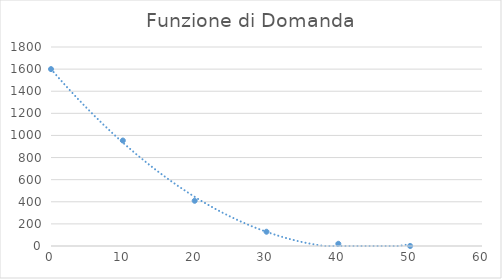
| Category | Series 0 |
|---|---|
| 0.0 | 1600 |
| 10.0 | 954 |
| 20.0 | 409 |
| 30.0 | 129 |
| 40.0 | 20 |
| 50.0 | 0 |